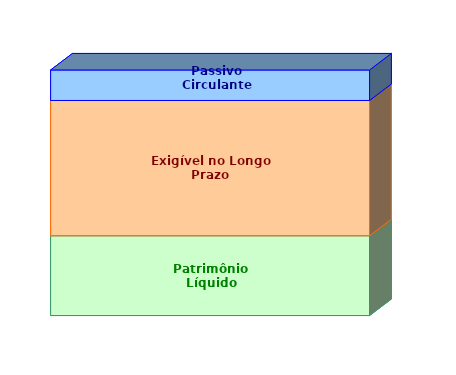
| Category | Patrimônio Líquido | Exigível no Longo Prazo | Passivo Circulante |
|---|---|---|---|
| 0 | 0.325 | 0.551 | 0.124 |